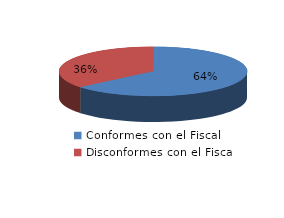
| Category | Series 0 |
|---|---|
| 0 | 126 |
| 1 | 71 |